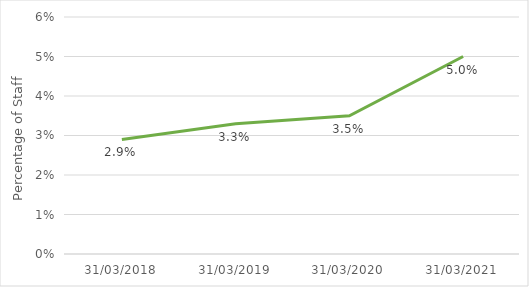
| Category | Total |
|---|---|
| 31/03/2018 | 0.029 |
| 31/03/2019 | 0.033 |
| 31/03/2020 | 0.035 |
| 31/03/2021 | 0.05 |